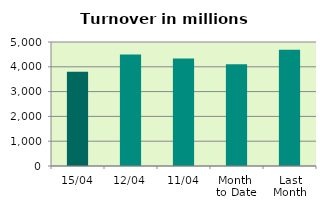
| Category | Series 0 |
|---|---|
| 15/04 | 3801.227 |
| 12/04 | 4495.625 |
| 11/04 | 4337.219 |
| Month 
to Date | 4105.07 |
| Last
Month | 4683.179 |